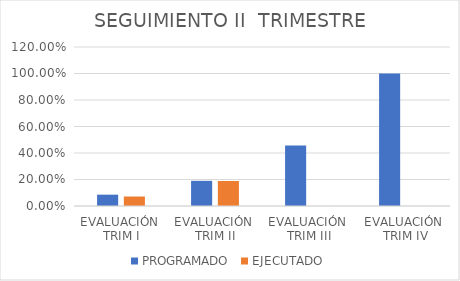
| Category | PROGRAMADO | EJECUTADO |
|---|---|---|
| EVALUACIÓN 
TRIM I | 0.086 | 0.072 |
| EVALUACIÓN 
TRIM II | 0.19 | 0.189 |
| EVALUACIÓN 
TRIM III | 0.456 | 0 |
| EVALUACIÓN
 TRIM IV | 1 | 0 |